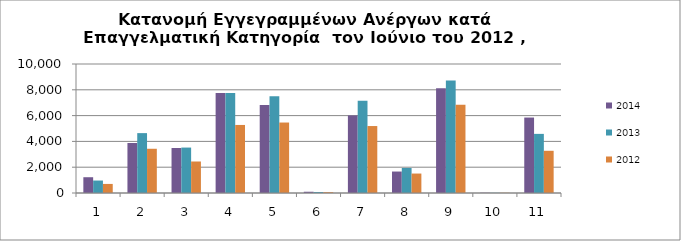
| Category | 2014 | 2013 | 2012 |
|---|---|---|---|
| 1.0 | 1223 | 966 | 703 |
| 2.0 | 3877 | 4642 | 3429 |
| 3.0 | 3487 | 3522 | 2442 |
| 4.0 | 7748 | 7743 | 5275 |
| 5.0 | 6821 | 7503 | 5463 |
| 6.0 | 97 | 78 | 66 |
| 7.0 | 6015 | 7147 | 5191 |
| 8.0 | 1664 | 1942 | 1508 |
| 9.0 | 8124 | 8722 | 6850 |
| 10.0 | 20 | 15 | 16 |
| 11.0 | 5849 | 4583 | 3272 |